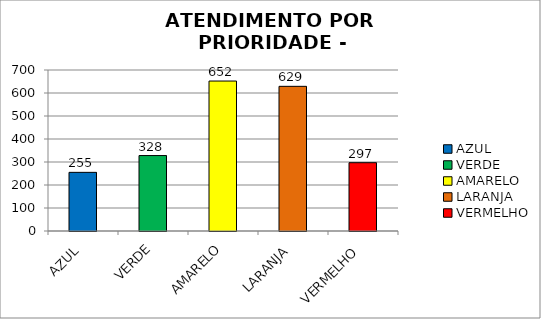
| Category | Total Regional: |
|---|---|
| AZUL | 255 |
| VERDE | 328 |
| AMARELO | 652 |
| LARANJA | 629 |
| VERMELHO | 297 |